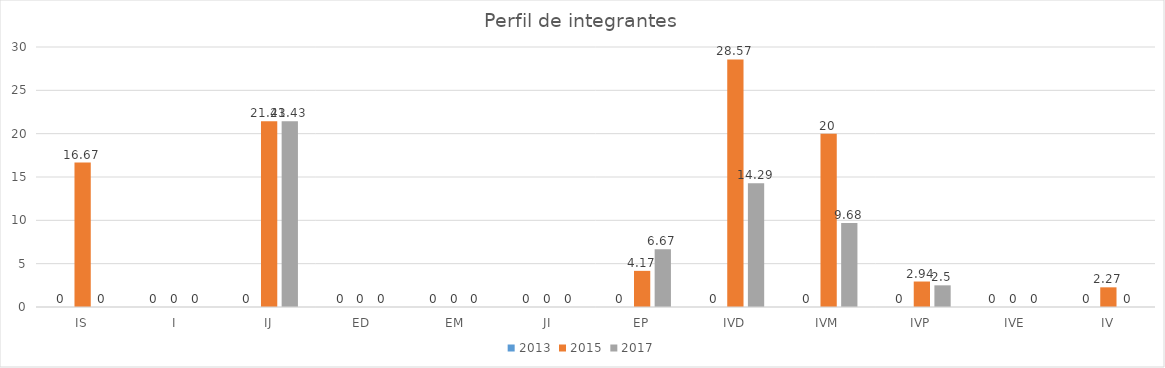
| Category | 2013 | 2015 | 2017 |
|---|---|---|---|
| IS | 0 | 16.67 | 0 |
| I | 0 | 0 | 0 |
| IJ | 0 | 21.43 | 21.43 |
| ED | 0 | 0 | 0 |
| EM | 0 | 0 | 0 |
| JI | 0 | 0 | 0 |
| EP | 0 | 4.17 | 6.67 |
| IVD | 0 | 28.57 | 14.29 |
| IVM | 0 | 20 | 9.68 |
| IVP | 0 | 2.94 | 2.5 |
| IVE | 0 | 0 | 0 |
| IV | 0 | 2.27 | 0 |